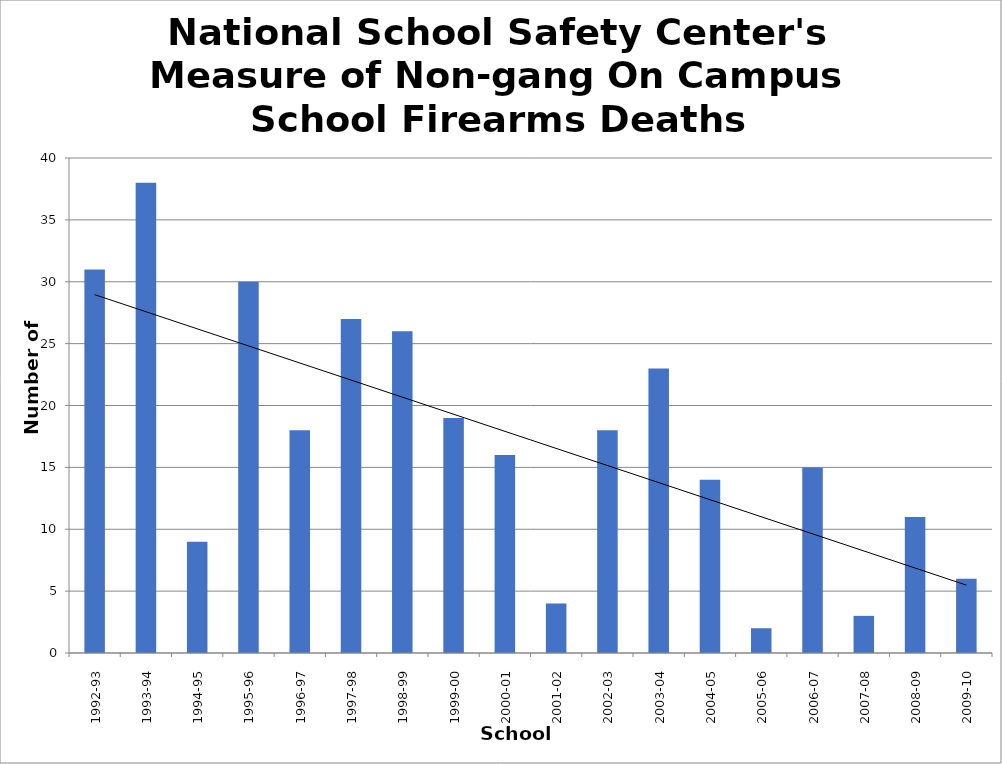
| Category | Non-gang On Campus School Firearm Deaths |
|---|---|
| 1992-93 | 31 |
| 1993-94 | 38 |
| 1994-95 | 9 |
| 1995-96 | 30 |
| 1996-97 | 18 |
| 1997-98 | 27 |
| 1998-99 | 26 |
| 1999-00 | 19 |
| 2000-01 | 16 |
| 2001-02 | 4 |
| 2002-03 | 18 |
| 2003-04 | 23 |
| 2004-05 | 14 |
| 2005-06 | 2 |
| 2006-07 | 15 |
| 2007-08 | 3 |
| 2008-09 | 11 |
| 2009-10 | 6 |